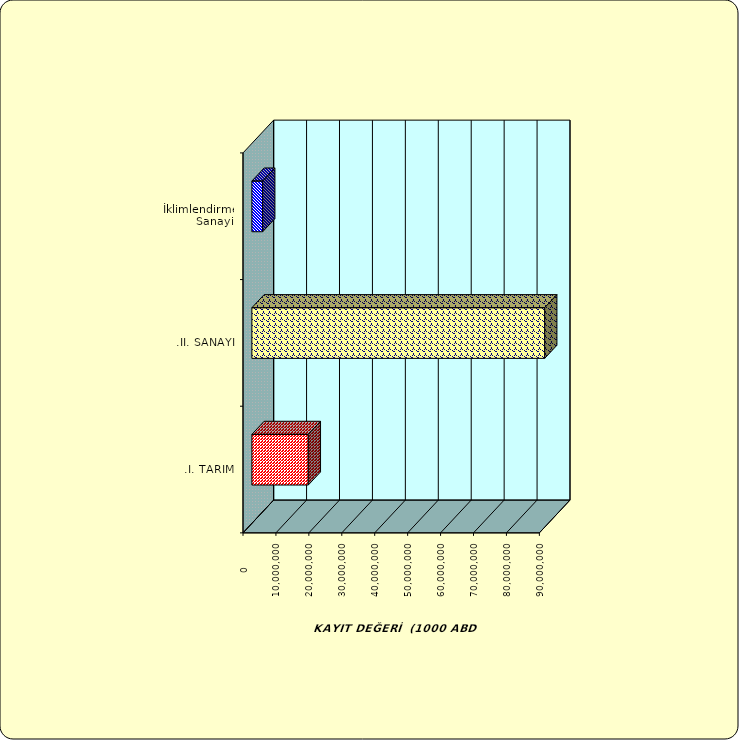
| Category | Series 0 |
|---|---|
| .I. TARIM | 17130354.689 |
| .II. SANAYİ | 88921494.904 |
|  İklimlendirme Sanayii | 3278405.124 |